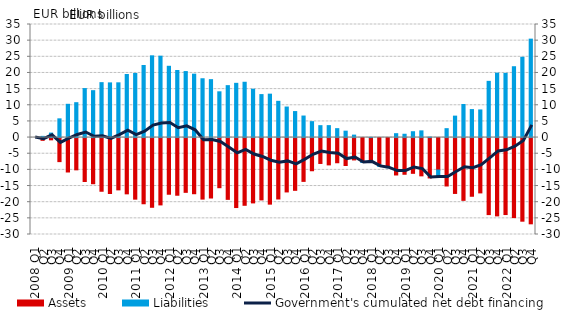
| Category | Assets | Liabilities |
|---|---|---|
| 2008 Q1 | 0 | 0 |
| Q2 | -0.851 | 0.372 |
| Q3 | -0.698 | 1.388 |
| Q4 | -7.444 | 5.798 |
| 2009 Q1 | -10.651 | 10.301 |
| Q2 | -9.986 | 10.798 |
| Q3 | -13.594 | 15.17 |
| Q4 | -14.283 | 14.52 |
| 2010 Q1 | -16.613 | 17.005 |
| Q2 | -17.314 | 16.929 |
| Q3 | -16.185 | 16.948 |
| Q4 | -17.416 | 19.527 |
| 2011 Q1 | -19.061 | 19.849 |
| Q2 | -20.485 | 22.309 |
| Q3 | -21.575 | 25.301 |
| Q4 | -20.841 | 25.195 |
| 2012 Q1 | -17.539 | 22.066 |
| Q2 | -17.847 | 20.761 |
| Q3 | -16.951 | 20.433 |
| Q4 | -17.379 | 19.629 |
| 2013 Q1 | -19.043 | 18.207 |
| Q2 | -18.703 | 17.929 |
| Q3 | -15.515 | 14.165 |
| Q4 | -19.124 | 16.074 |
| 2014 Q1 | -21.656 | 16.791 |
| Q2 | -20.959 | 17.124 |
| Q3 | -20.221 | 14.972 |
| Q4 | -19.295 | 13.303 |
| 2015 Q1 | -20.605 | 13.44 |
| Q2 | -19.008 | 11.22 |
| Q3 | -16.826 | 9.454 |
| Q4 | -16.33 | 8.051 |
| 2016 Q1 | -13.559 | 6.668 |
| Q2 | -10.267 | 4.929 |
| Q3 | -8.014 | 3.69 |
| Q4 | -8.453 | 3.701 |
| 2017 Q1 | -7.794 | 2.764 |
| Q2 | -8.643 | 1.985 |
| Q3 | -6.917 | 0.76 |
| Q4 | -7.651 | -0.06 |
| 2018 Q1 | -7.579 | 0.052 |
| Q2 | -8.44 | -0.488 |
| Q3 | -8.984 | -0.342 |
| Q4 | -11.578 | 1.207 |
| 2019 Q1 | -11.356 | 1.029 |
| Q2 | -11.067 | 1.812 |
| Q3 | -11.845 | 2.076 |
| Q4 | -12.496 | 0.139 |
| 2020 Q1 | -10.041 | -2.186 |
| Q2 | -14.982 | 2.76 |
| Q3 | -17.291 | 6.64 |
| Q4 | -19.43 | 10.246 |
| 2021 Q1 | -18.165 | 8.667 |
| Q2 | -17.125 | 8.555 |
| Q3 | -23.84 | 17.401 |
| Q4 | -24.237 | 19.941 |
| 2022 Q1 | -23.825 | 19.876 |
| Q2 | -24.769 | 21.93 |
| Q3 | -25.879 | 24.86 |
| Q4 | -26.694 | 30.466 |